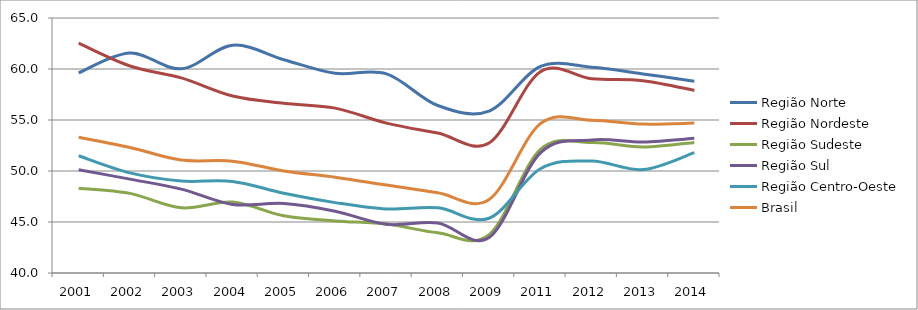
| Category | Região Norte | Região Nordeste | Região Sudeste | Região Sul | Região Centro-Oeste | Brasil |
|---|---|---|---|---|---|---|
| 2001.0 | 59.617 | 62.532 | 48.31 | 50.121 | 51.49 | 53.3 |
| 2002.0 | 61.559 | 60.296 | 47.807 | 49.201 | 49.815 | 52.311 |
| 2003.0 | 60.02 | 59.124 | 46.394 | 48.226 | 49.014 | 51.07 |
| 2004.0 | 62.33 | 57.348 | 46.96 | 46.723 | 48.969 | 50.967 |
| 2005.0 | 60.912 | 56.633 | 45.605 | 46.813 | 47.813 | 50.01 |
| 2006.0 | 59.581 | 56.165 | 45.104 | 46.053 | 46.9 | 49.39 |
| 2007.0 | 59.525 | 54.692 | 44.795 | 44.774 | 46.274 | 48.62 |
| 2008.0 | 56.418 | 53.717 | 43.941 | 44.901 | 46.388 | 47.862 |
| 2009.0 | 55.87 | 52.748 | 43.75 | 43.469 | 45.37 | 47.199 |
| 2011.0 | 60.25 | 59.74 | 52.12 | 51.78 | 50.22 | 54.64 |
| 2012.0 | 60.171 | 59.039 | 52.785 | 53.049 | 50.975 | 54.982 |
| 2013.0 | 59.517 | 58.857 | 52.351 | 52.852 | 50.138 | 54.597 |
| 2014.0 | 58.8 | 57.9 | 52.8 | 53.2 | 51.8 | 54.7 |